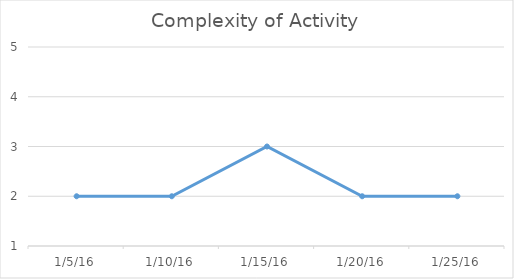
| Category | Series 0 |
|---|---|
| 1/5/16 | 2 |
| 1/10/16 | 2 |
| 1/15/16 | 3 |
| 1/20/16 | 2 |
| 1/25/16 | 2 |